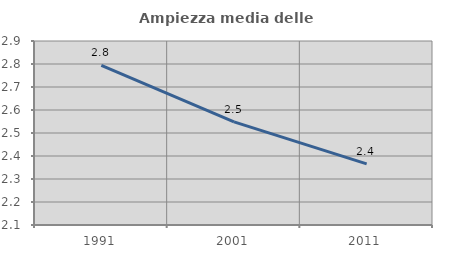
| Category | Ampiezza media delle famiglie |
|---|---|
| 1991.0 | 2.794 |
| 2001.0 | 2.549 |
| 2011.0 | 2.366 |